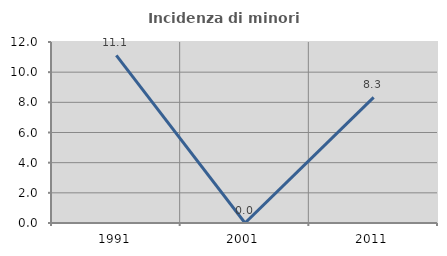
| Category | Incidenza di minori stranieri |
|---|---|
| 1991.0 | 11.111 |
| 2001.0 | 0 |
| 2011.0 | 8.333 |